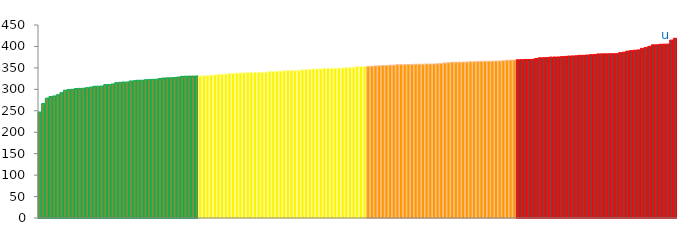
| Category | Top Quartile | 2nd Quartile | 3rd Quartile | Bottom Quartile | Series 4 |
|---|---|---|---|---|---|
|  | 247.1 | 0 | 0 | 0 | 247.1 |
|  | 266.8 | 0 | 0 | 0 | 266.8 |
|  | 279.5 | 0 | 0 | 0 | 279.5 |
|  | 283.2 | 0 | 0 | 0 | 283.2 |
|  | 284.5 | 0 | 0 | 0 | 284.5 |
|  | 287.4 | 0 | 0 | 0 | 287.4 |
|  | 292.2 | 0 | 0 | 0 | 292.2 |
|  | 298 | 0 | 0 | 0 | 298 |
|  | 299.5 | 0 | 0 | 0 | 299.5 |
|  | 300.1 | 0 | 0 | 0 | 300.1 |
|  | 301.8 | 0 | 0 | 0 | 301.8 |
|  | 302.2 | 0 | 0 | 0 | 302.2 |
|  | 302.6 | 0 | 0 | 0 | 302.6 |
|  | 303.9 | 0 | 0 | 0 | 303.9 |
|  | 305.1 | 0 | 0 | 0 | 305.1 |
|  | 307.1 | 0 | 0 | 0 | 307.1 |
|  | 307.4 | 0 | 0 | 0 | 307.4 |
|  | 307.5 | 0 | 0 | 0 | 307.5 |
|  | 311 | 0 | 0 | 0 | 311 |
|  | 311.2 | 0 | 0 | 0 | 311.2 |
|  | 312.5 | 0 | 0 | 0 | 312.5 |
|  | 315.5 | 0 | 0 | 0 | 315.5 |
|  | 316.2 | 0 | 0 | 0 | 316.2 |
|  | 317.1 | 0 | 0 | 0 | 317.1 |
|  | 317.1 | 0 | 0 | 0 | 317.1 |
|  | 319.5 | 0 | 0 | 0 | 319.5 |
|  | 320.2 | 0 | 0 | 0 | 320.2 |
|  | 321.2 | 0 | 0 | 0 | 321.2 |
|  | 321.2 | 0 | 0 | 0 | 321.2 |
|  | 322.2 | 0 | 0 | 0 | 322.2 |
|  | 322.7 | 0 | 0 | 0 | 322.7 |
|  | 323.2 | 0 | 0 | 0 | 323.2 |
|  | 323.7 | 0 | 0 | 0 | 323.7 |
|  | 325.4 | 0 | 0 | 0 | 325.4 |
|  | 326.4 | 0 | 0 | 0 | 326.4 |
|  | 326.8 | 0 | 0 | 0 | 326.8 |
|  | 326.9 | 0 | 0 | 0 | 326.9 |
|  | 327.4 | 0 | 0 | 0 | 327.4 |
|  | 328.7 | 0 | 0 | 0 | 328.7 |
|  | 330.3 | 0 | 0 | 0 | 330.3 |
|  | 330.6 | 0 | 0 | 0 | 330.6 |
|  | 330.8 | 0 | 0 | 0 | 330.8 |
|  | 330.9 | 0 | 0 | 0 | 330.9 |
|  | 331.1 | 0 | 0 | 0 | 331.1 |
|  | 0 | 331.2 | 0 | 0 | 331.2 |
|  | 0 | 331.8 | 0 | 0 | 331.8 |
|  | 0 | 331.8 | 0 | 0 | 331.8 |
|  | 0 | 333.2 | 0 | 0 | 333.2 |
|  | 0 | 333.5 | 0 | 0 | 333.5 |
|  | 0 | 335.2 | 0 | 0 | 335.2 |
|  | 0 | 335.3 | 0 | 0 | 335.3 |
|  | 0 | 335.4 | 0 | 0 | 335.4 |
|  | 0 | 337 | 0 | 0 | 337 |
|  | 0 | 337.1 | 0 | 0 | 337.1 |
|  | 0 | 337.8 | 0 | 0 | 337.8 |
|  | 0 | 338.1 | 0 | 0 | 338.1 |
|  | 0 | 338.5 | 0 | 0 | 338.5 |
|  | 0 | 338.9 | 0 | 0 | 338.9 |
|  | 0 | 339.4 | 0 | 0 | 339.4 |
|  | 0 | 339.4 | 0 | 0 | 339.4 |
|  | 0 | 339.5 | 0 | 0 | 339.5 |
|  | 0 | 339.7 | 0 | 0 | 339.7 |
|  | 0 | 340.1 | 0 | 0 | 340.1 |
|  | 0 | 341.6 | 0 | 0 | 341.6 |
|  | 0 | 341.6 | 0 | 0 | 341.6 |
|  | 0 | 342.1 | 0 | 0 | 342.1 |
|  | 0 | 342.5 | 0 | 0 | 342.5 |
|  | 0 | 343.3 | 0 | 0 | 343.3 |
|  | 0 | 343.7 | 0 | 0 | 343.7 |
|  | 0 | 343.8 | 0 | 0 | 343.8 |
|  | 0 | 343.9 | 0 | 0 | 343.9 |
|  | 0 | 344.3 | 0 | 0 | 344.3 |
|  | 0 | 345.5 | 0 | 0 | 345.5 |
|  | 0 | 345.7 | 0 | 0 | 345.7 |
|  | 0 | 346.7 | 0 | 0 | 346.7 |
|  | 0 | 347.3 | 0 | 0 | 347.3 |
|  | 0 | 347.5 | 0 | 0 | 347.5 |
|  | 0 | 347.5 | 0 | 0 | 347.5 |
|  | 0 | 348.9 | 0 | 0 | 348.9 |
|  | 0 | 349 | 0 | 0 | 349 |
|  | 0 | 349.1 | 0 | 0 | 349.1 |
|  | 0 | 349.3 | 0 | 0 | 349.3 |
|  | 0 | 349.4 | 0 | 0 | 349.4 |
|  | 0 | 349.7 | 0 | 0 | 349.7 |
|  | 0 | 350.5 | 0 | 0 | 350.5 |
|  | 0 | 351.1 | 0 | 0 | 351.1 |
|  | 0 | 351.6 | 0 | 0 | 351.6 |
|  | 0 | 353.2 | 0 | 0 | 353.2 |
|  | 0 | 353.2 | 0 | 0 | 353.2 |
|  | 0 | 353.2 | 0 | 0 | 353.2 |
|  | 0 | 0 | 353.5 | 0 | 353.5 |
|  | 0 | 0 | 353.7 | 0 | 353.7 |
|  | 0 | 0 | 354.6 | 0 | 354.6 |
|  | 0 | 0 | 354.8 | 0 | 354.8 |
|  | 0 | 0 | 355.4 | 0 | 355.4 |
|  | 0 | 0 | 355.4 | 0 | 355.4 |
|  | 0 | 0 | 356.4 | 0 | 356.4 |
|  | 0 | 0 | 356.5 | 0 | 356.5 |
|  | 0 | 0 | 357.4 | 0 | 357.4 |
|  | 0 | 0 | 357.5 | 0 | 357.5 |
|  | 0 | 0 | 357.5 | 0 | 357.5 |
|  | 0 | 0 | 357.9 | 0 | 357.9 |
|  | 0 | 0 | 358 | 0 | 358 |
|  | 0 | 0 | 358.4 | 0 | 358.4 |
|  | 0 | 0 | 358.7 | 0 | 358.7 |
|  | 0 | 0 | 358.7 | 0 | 358.7 |
|  | 0 | 0 | 359.1 | 0 | 359.1 |
|  | 0 | 0 | 359.1 | 0 | 359.1 |
|  | 0 | 0 | 359.2 | 0 | 359.2 |
|  | 0 | 0 | 359.6 | 0 | 359.6 |
|  | 0 | 0 | 360.2 | 0 | 360.2 |
|  | 0 | 0 | 361.5 | 0 | 361.5 |
|  | 0 | 0 | 362 | 0 | 362 |
|  | 0 | 0 | 363.2 | 0 | 363.2 |
|  | 0 | 0 | 363.2 | 0 | 363.2 |
|  | 0 | 0 | 363.2 | 0 | 363.2 |
|  | 0 | 0 | 363.5 | 0 | 363.5 |
|  | 0 | 0 | 363.6 | 0 | 363.6 |
|  | 0 | 0 | 364.2 | 0 | 364.2 |
|  | 0 | 0 | 364.2 | 0 | 364.2 |
|  | 0 | 0 | 364.6 | 0 | 364.6 |
|  | 0 | 0 | 365.2 | 0 | 365.2 |
|  | 0 | 0 | 365.4 | 0 | 365.4 |
|  | 0 | 0 | 365.6 | 0 | 365.6 |
|  | 0 | 0 | 365.7 | 0 | 365.7 |
|  | 0 | 0 | 366 | 0 | 366 |
|  | 0 | 0 | 366 | 0 | 366 |
|  | 0 | 0 | 366.7 | 0 | 366.7 |
|  | 0 | 0 | 367.7 | 0 | 367.7 |
|  | 0 | 0 | 368 | 0 | 368 |
|  | 0 | 0 | 368.4 | 0 | 368.4 |
|  | 0 | 0 | 0 | 369 | 369 |
|  | 0 | 0 | 0 | 369.1 | 369.1 |
|  | 0 | 0 | 0 | 369.7 | 369.7 |
|  | 0 | 0 | 0 | 369.7 | 369.7 |
|  | 0 | 0 | 0 | 369.9 | 369.9 |
|  | 0 | 0 | 0 | 371.8 | 371.8 |
|  | 0 | 0 | 0 | 373.6 | 373.6 |
|  | 0 | 0 | 0 | 373.7 | 373.7 |
|  | 0 | 0 | 0 | 374.1 | 374.1 |
|  | 0 | 0 | 0 | 375.2 | 375.2 |
|  | 0 | 0 | 0 | 375.3 | 375.3 |
|  | 0 | 0 | 0 | 375.5 | 375.5 |
|  | 0 | 0 | 0 | 376.2 | 376.2 |
|  | 0 | 0 | 0 | 376.7 | 376.7 |
|  | 0 | 0 | 0 | 377.6 | 377.6 |
|  | 0 | 0 | 0 | 377.9 | 377.9 |
|  | 0 | 0 | 0 | 378.3 | 378.3 |
|  | 0 | 0 | 0 | 379.3 | 379.3 |
|  | 0 | 0 | 0 | 379.3 | 379.3 |
|  | 0 | 0 | 0 | 379.8 | 379.8 |
|  | 0 | 0 | 0 | 380.9 | 380.9 |
|  | 0 | 0 | 0 | 381 | 381 |
|  | 0 | 0 | 0 | 382.6 | 382.6 |
|  | 0 | 0 | 0 | 382.8 | 382.8 |
|  | 0 | 0 | 0 | 382.8 | 382.8 |
|  | 0 | 0 | 0 | 382.9 | 382.9 |
|  | 0 | 0 | 0 | 383.1 | 383.1 |
|  | 0 | 0 | 0 | 383.1 | 383.1 |
|  | 0 | 0 | 0 | 385.5 | 385.5 |
|  | 0 | 0 | 0 | 386.7 | 386.7 |
|  | 0 | 0 | 0 | 389.1 | 389.1 |
|  | 0 | 0 | 0 | 390.3 | 390.3 |
|  | 0 | 0 | 0 | 391.3 | 391.3 |
|  | 0 | 0 | 0 | 391.9 | 391.9 |
|  | 0 | 0 | 0 | 395.5 | 395.5 |
|  | 0 | 0 | 0 | 397.7 | 397.7 |
|  | 0 | 0 | 0 | 400.1 | 400.1 |
|  | 0 | 0 | 0 | 403.8 | 403.8 |
|  | 0 | 0 | 0 | 403.8 | 403.8 |
|  | 0 | 0 | 0 | 405 | 405 |
|  | 0 | 0 | 0 | 405.4 | 405.4 |
| u | 0 | 0 | 0 | 405.5 | 405.5 |